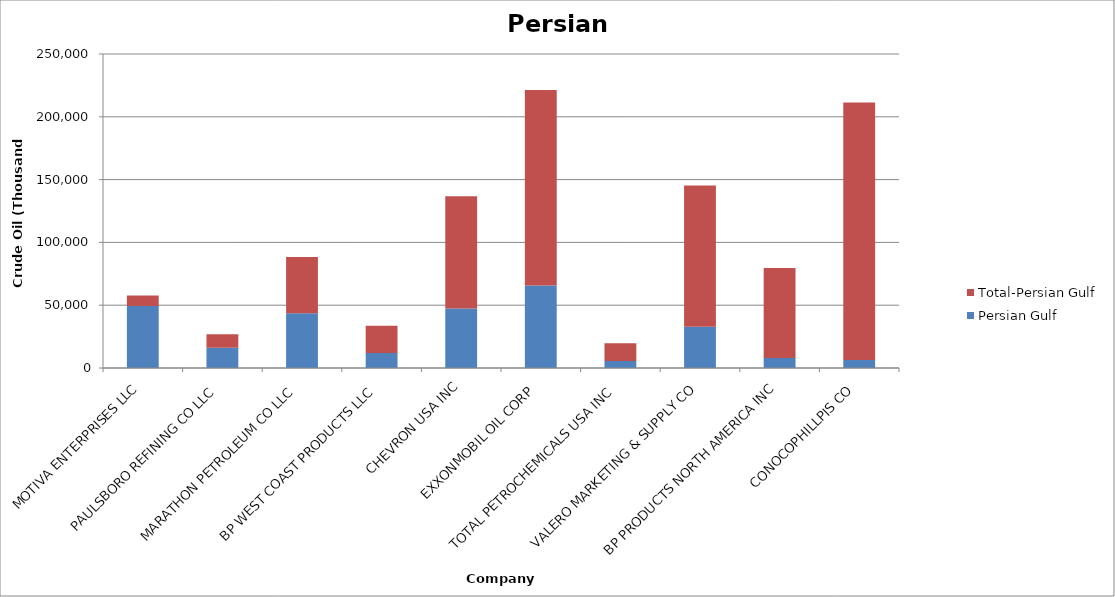
| Category | Persian Gulf | Total-Persian Gulf |
|---|---|---|
| MOTIVA ENTERPRISES LLC | 49433 | 8216 |
| PAULSBORO REFINING CO LLC | 16144 | 10816 |
| MARATHON PETROLEUM CO LLC | 43563 | 44838 |
| BP WEST COAST PRODUCTS LLC | 12038 | 21649 |
| CHEVRON USA INC | 47382 | 89356 |
| EXXONMOBIL OIL CORP | 65602 | 155717 |
| TOTAL PETROCHEMICALS USA INC | 5663 | 13978 |
| VALERO MARKETING & SUPPLY CO | 32895 | 112470 |
| BP PRODUCTS NORTH AMERICA INC | 7901 | 71688 |
| CONOCOPHILLPIS CO | 6271 | 205025 |